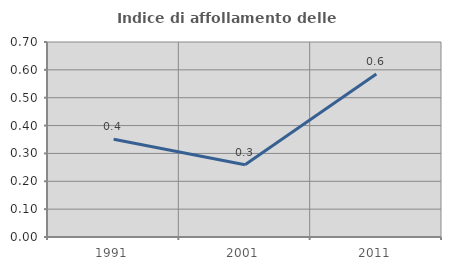
| Category | Indice di affollamento delle abitazioni  |
|---|---|
| 1991.0 | 0.351 |
| 2001.0 | 0.259 |
| 2011.0 | 0.585 |